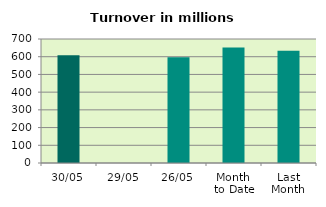
| Category | Series 0 |
|---|---|
| 30/05 | 607.923 |
| 29/05 | 0 |
| 26/05 | 597.176 |
| Month 
to Date | 652.54 |
| Last
Month | 634.312 |